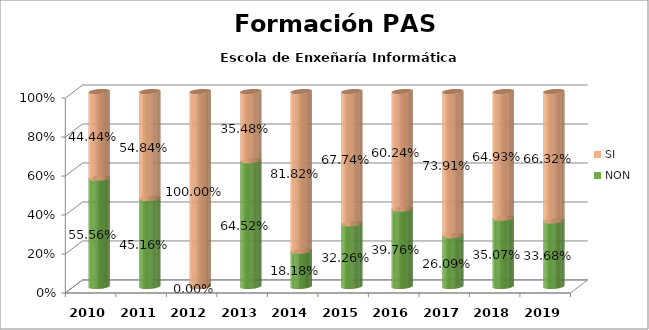
| Category | NON | SI |
|---|---|---|
| 2010.0 | 0.556 | 0.444 |
| 2011.0 | 0.452 | 0.548 |
| 2012.0 | 0 | 1 |
| 2013.0 | 0.645 | 0.355 |
| 2014.0 | 0.182 | 0.818 |
| 2015.0 | 0.323 | 0.677 |
| 2016.0 | 0.398 | 0.602 |
| 2017.0 | 0.261 | 0.739 |
| 2018.0 | 0.351 | 0.649 |
| 2019.0 | 0.337 | 0.663 |